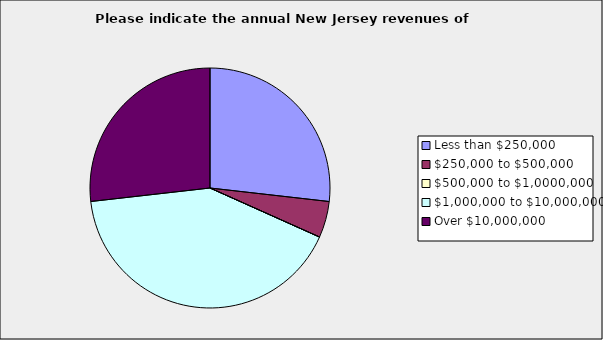
| Category | Series 0 |
|---|---|
| Less than $250,000 | 0.268 |
| $250,000 to $500,000 | 0.049 |
| $500,000 to $1,0000,000 | 0 |
| $1,000,000 to $10,000,000 | 0.415 |
| Over $10,000,000 | 0.268 |